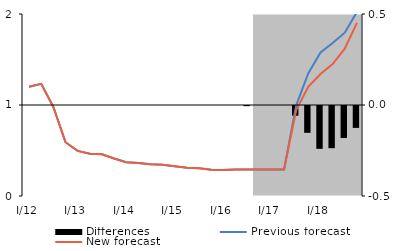
| Category | Differences |
|---|---|
| 0 | 0 |
| 1 | 0 |
| 2 | 0 |
| 3 | 0 |
| 4 | 0 |
| 5 | 0 |
| 6 | 0 |
| 7 | 0 |
| 8 | 0 |
| 9 | 0 |
| 10 | 0 |
| 11 | 0 |
| 12 | 0 |
| 13 | 0 |
| 14 | 0 |
| 15 | 0 |
| 16 | 0 |
| 17 | 0 |
| 18 | -0.001 |
| 19 | 0 |
| 20 | 0 |
| 21 | 0 |
| 22 | -0.053 |
| 23 | -0.147 |
| 24 | -0.235 |
| 25 | -0.232 |
| 26 | -0.176 |
| 27 | -0.12 |